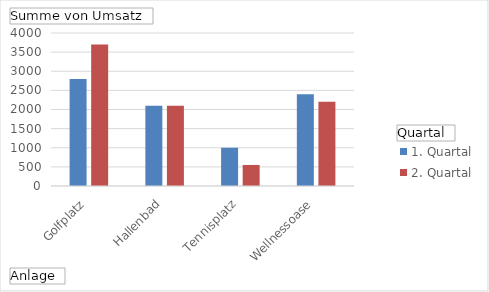
| Category | 1. Quartal | 2. Quartal |
|---|---|---|
| Golfplatz | 2800 | 3700 |
| Hallenbad | 2100 | 2100 |
| Tennisplatz | 1000 | 550 |
| Wellnessoase | 2400 | 2200 |